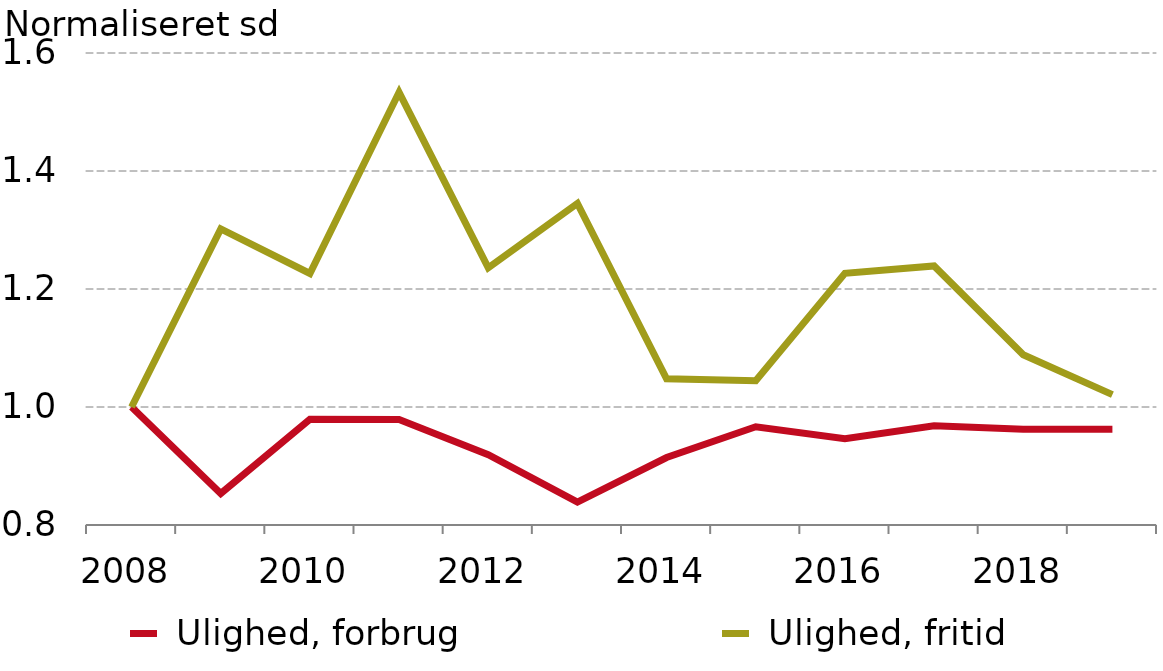
| Category |  Ulighed, forbrug |  Ulighed, fritid |
|---|---|---|
| 2008.0 | 1 | 1 |
| 2009.0 | 0.853 | 1.302 |
| 2010.0 | 0.979 | 1.226 |
| 2011.0 | 0.979 | 1.533 |
| 2012.0 | 0.919 | 1.236 |
| 2013.0 | 0.839 | 1.345 |
| 2014.0 | 0.914 | 1.048 |
| 2015.0 | 0.966 | 1.045 |
| 2016.0 | 0.946 | 1.227 |
| 2017.0 | 0.968 | 1.239 |
| 2018.0 | 0.962 | 1.089 |
| 2019.0 | 0.962 | 1.021 |